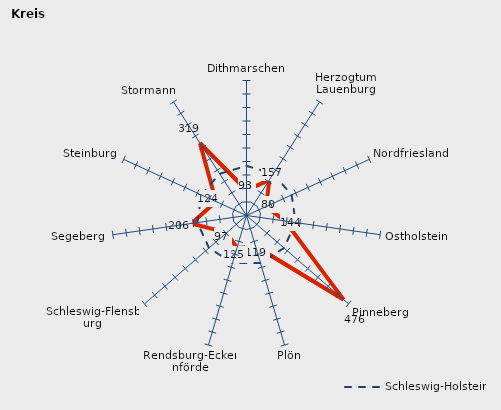
| Category | Kreise | Schleswig-Holstein |
|---|---|---|
| Dithmarschen | 93.261 | 183.733 |
| Herzogtum Lauenburg | 156.776 | 183.733 |
| Nordfriesland | 79.648 | 183.733 |
| Ostholstein | 143.96 | 183.733 |
| Pinneberg | 475.877 | 183.733 |
| Plön | 118.762 | 183.733 |
| Rendsburg-Eckernförde | 125.171 | 183.733 |
| Schleswig-Flensburg | 97.117 | 183.733 |
| Segeberg | 206.16 | 183.733 |
| Steinburg | 124.101 | 183.733 |
| Stormann | 318.653 | 183.733 |